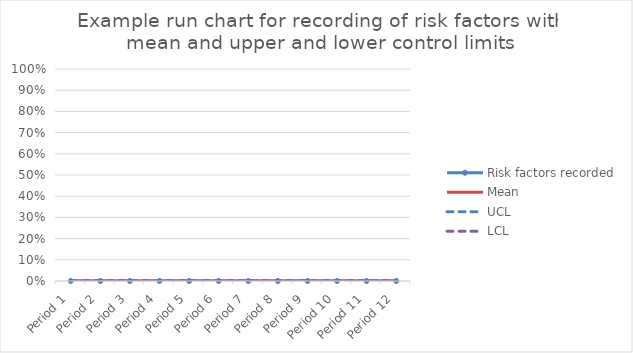
| Category | Risk factors recorded | Mean | UCL | LCL |
|---|---|---|---|---|
| Period 1 | 0 | 0 | 0 | 0 |
| Period 2 | 0 | 0 | 0 | 0 |
| Period 3 | 0 | 0 | 0 | 0 |
| Period 4 | 0 | 0 | 0 | 0 |
| Period 5 | 0 | 0 | 0 | 0 |
| Period 6 | 0 | 0 | 0 | 0 |
| Period 7 | 0 | 0 | 0 | 0 |
| Period 8 | 0 | 0 | 0 | 0 |
| Period 9 | 0 | 0 | 0 | 0 |
| Period 10 | 0 | 0 | 0 | 0 |
| Period 11 | 0 | 0 | 0 | 0 |
| Period 12 | 0 | 0 | 0 | 0 |